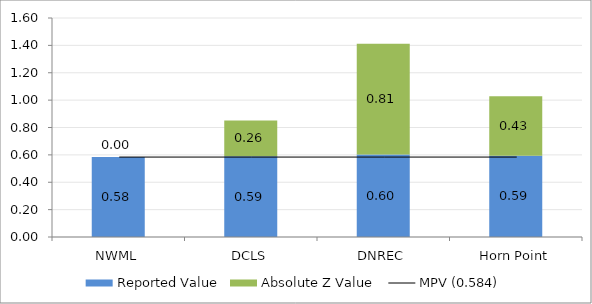
| Category | Reported Value | Absolute Z Value  |
|---|---|---|
| NWML | 0.584 | 0 |
| DCLS | 0.59 | 0.261 |
| DNREC | 0.603 | 0.809 |
| Horn Point | 0.594 | 0.435 |